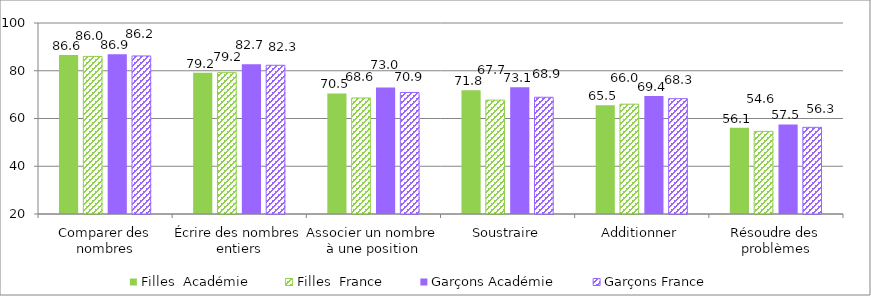
| Category | Filles  | Garçons |
|---|---|---|
| Comparer des nombres | 86 | 86.2 |
| Écrire des nombres entiers | 79.2 | 82.3 |
| Associer un nombre à une position | 68.6 | 70.9 |
| Soustraire | 67.7 | 68.9 |
| Additionner | 66 | 68.3 |
| Résoudre des problèmes | 54.6 | 56.3 |